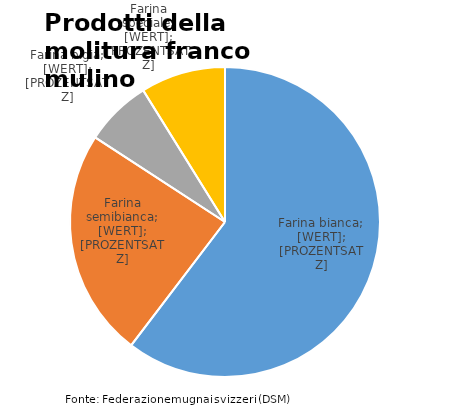
| Category | Series 0 |
|---|---|
| Farina bianca | 226211.704 |
| Farina semibianca | 89350.346 |
| Farina bigia | 26106.419 |
| Farina speciale | 33171.087 |